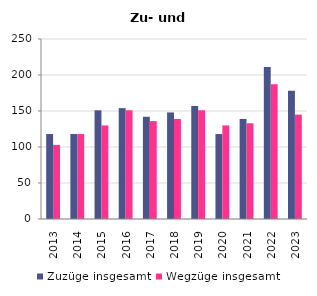
| Category | Zuzüge insgesamt | Wegzüge insgesamt |
|---|---|---|
| 2013.0 | 118 | 103 |
| 2014.0 | 118 | 118 |
| 2015.0 | 151 | 130 |
| 2016.0 | 154 | 151 |
| 2017.0 | 142 | 136 |
| 2018.0 | 148 | 139 |
| 2019.0 | 157 | 151 |
| 2020.0 | 118 | 130 |
| 2021.0 | 139 | 133 |
| 2022.0 | 211 | 187 |
| 2023.0 | 178 | 145 |